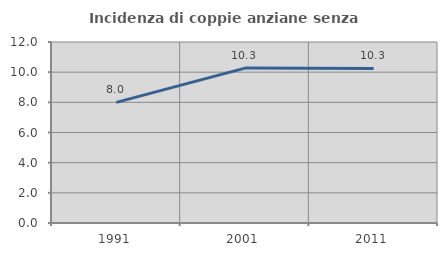
| Category | Incidenza di coppie anziane senza figli  |
|---|---|
| 1991.0 | 8 |
| 2001.0 | 10.27 |
| 2011.0 | 10.251 |